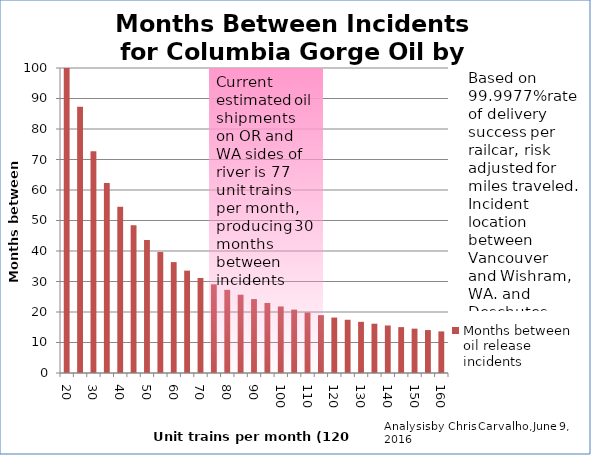
| Category | Months between oil release incidents |
|---|---|
| 20.0 | 109.073 |
| 25.0 | 87.258 |
| 30.0 | 72.715 |
| 35.0 | 62.327 |
| 40.0 | 54.537 |
| 45.0 | 48.477 |
| 50.0 | 43.629 |
| 55.0 | 39.663 |
| 60.0 | 36.358 |
| 65.0 | 33.561 |
| 70.0 | 31.164 |
| 75.0 | 29.086 |
| 80.0 | 27.268 |
| 85.0 | 25.664 |
| 90.0 | 24.238 |
| 95.0 | 22.963 |
| 100.0 | 21.815 |
| 105.0 | 20.776 |
| 110.0 | 19.831 |
| 115.0 | 18.969 |
| 120.0 | 18.179 |
| 125.0 | 17.452 |
| 130.0 | 16.78 |
| 135.0 | 16.159 |
| 140.0 | 15.582 |
| 145.0 | 15.045 |
| 150.0 | 14.543 |
| 155.0 | 14.074 |
| 160.0 | 13.634 |